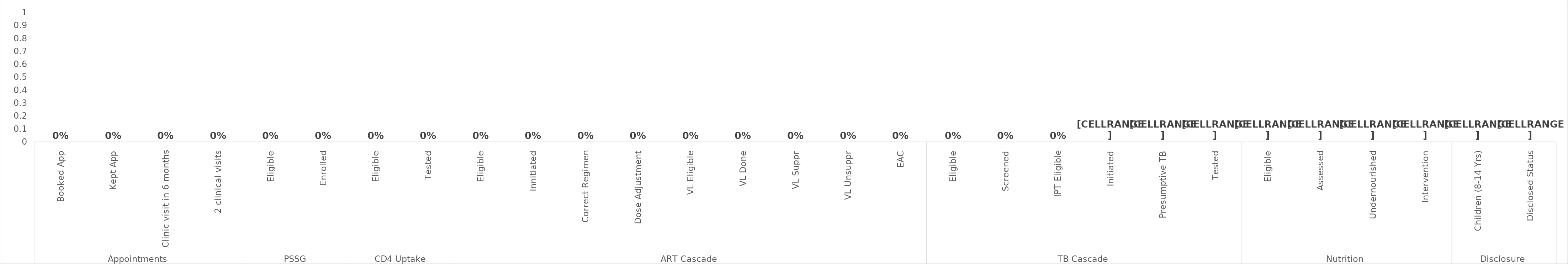
| Category | Total |
|---|---|
| 0 | 0 |
| 1 | 0 |
| 2 | 0 |
| 3 | 0 |
| 4 | 0 |
| 5 | 0 |
| 6 | 0 |
| 7 | 0 |
| 8 | 0 |
| 9 | 0 |
| 10 | 0 |
| 11 | 0 |
| 12 | 0 |
| 13 | 0 |
| 14 | 0 |
| 15 | 0 |
| 16 | 0 |
| 17 | 0 |
| 18 | 0 |
| 19 | 0 |
| 20 | 0 |
| 21 | 0 |
| 22 | 0 |
| 23 | 0 |
| 24 | 0 |
| 25 | 0 |
| 26 | 0 |
| 27 | 0 |
| 28 | 0 |